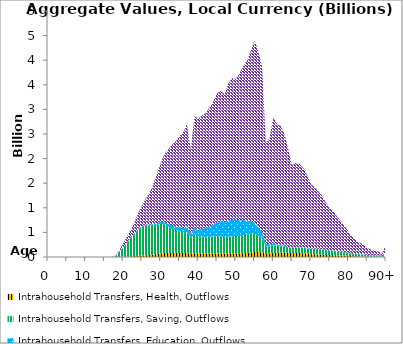
| Category | Intrahousehold Transfers, Health, Outflows | Intrahousehold Transfers, Saving, Outflows | Intrahousehold Transfers, Education, Outflows | Intrahousehold Transfers, Consumption other than health and education, Outflows |
|---|---|---|---|---|
| 0 | 0 | 0 | 0 | 0 |
|  | 0 | 0 | 0 | 0 |
| 2 | 0 | 0 | 0 | 0 |
| 3 | 0 | 0 | 0 | 0 |
| 4 | 0 | 0 | 0 | 0 |
| 5 | 0 | 0 | 0 | 0 |
| 6 | 0 | 0 | 0 | 0 |
| 7 | 0 | 0 | 0 | 0 |
| 8 | 0 | 0 | 0 | 0 |
| 9 | 0 | 0 | 0 | 0 |
| 10 | 0 | 0 | 0 | 0 |
| 11 | 0 | 0 | 0 | 0 |
| 12 | 0 | 0 | 0 | 0 |
| 13 | 0 | 0 | 0 | 0 |
| 14 | 0 | 0 | 0 | 0 |
| 15 | 0 | 0.012 | 0 | 0.002 |
| 16 | 0.004 | 0.12 | 0 | 0.112 |
| 17 | 0.012 | 1.714 | 0.008 | 0.146 |
| 18 | 0.34 | 16.93 | 0.686 | 9.93 |
| 19 | 1.321 | 103.145 | 3.721 | 36.324 |
| 20 | 4.648 | 187.638 | 5.847 | 73.819 |
| 21 | 7.855 | 280.53 | 8.076 | 116.932 |
| 22 | 12.068 | 367.101 | 10.371 | 163.048 |
| 23 | 18.044 | 450.398 | 11.619 | 229.375 |
| 24 | 23.233 | 540.06 | 12.349 | 315.246 |
| 25 | 27.668 | 584.253 | 12.83 | 405.222 |
| 26 | 34.873 | 613.429 | 13.35 | 524.926 |
| 27 | 41.714 | 598.201 | 15.242 | 652.961 |
| 28 | 49.29 | 606.843 | 18.647 | 801.529 |
| 29 | 59.084 | 597.184 | 26.199 | 995.435 |
| 30 | 70.276 | 606.795 | 37.058 | 1202.411 |
| 31 | 79.067 | 575.842 | 48.761 | 1383.607 |
| 32 | 82.101 | 540.527 | 54.924 | 1510.836 |
| 33 | 82.518 | 487.781 | 64.597 | 1647.742 |
| 34 | 84.834 | 464.434 | 71.629 | 1734.648 |
| 35 | 83.252 | 436.513 | 78.554 | 1856.155 |
| 36 | 81.358 | 419.827 | 84.51 | 1943.67 |
| 37 | 80.651 | 429.592 | 98.156 | 2092.436 |
| 38 | 63.14 | 321.452 | 85.313 | 1720.154 |
| 39 | 75.526 | 391.127 | 122.512 | 2276.624 |
| 40 | 72.123 | 350.564 | 133.823 | 2252.561 |
| 41 | 69.13 | 350.252 | 155.657 | 2308.576 |
| 42 | 69.053 | 333.143 | 178.349 | 2350.169 |
| 43 | 68.021 | 342.752 | 208.536 | 2417.339 |
| 44 | 67.006 | 354.352 | 242.453 | 2498.518 |
| 45 | 70.551 | 354.112 | 276.834 | 2629.007 |
| 46 | 70.471 | 347.827 | 296.807 | 2660.385 |
| 47 | 63.861 | 338.714 | 306.107 | 2595.995 |
| 48 | 66.998 | 347.553 | 329.983 | 2785.6 |
| 49 | 70.058 | 347.903 | 335.426 | 2885.24 |
| 50 | 67.239 | 359.458 | 331.263 | 2864.826 |
| 51 | 68.985 | 355.687 | 320.94 | 2989.275 |
| 52 | 76.053 | 369.21 | 306.305 | 3125.577 |
| 53 | 81.501 | 373.646 | 283.145 | 3260.454 |
| 54 | 89.396 | 379.41 | 260.958 | 3459.992 |
| 55 | 99.915 | 368.124 | 222.955 | 3710.063 |
| 56 | 99.995 | 331.469 | 175.322 | 3572.719 |
| 57 | 97.732 | 285.279 | 122.471 | 3370.294 |
| 58 | 59.177 | 154.393 | 55.678 | 2034.334 |
| 59 | 65.942 | 147.228 | 42.921 | 2164.194 |
| 60 | 81.739 | 159.826 | 33.309 | 2570.908 |
| 61 | 82.424 | 145.663 | 24.587 | 2446.828 |
| 62 | 88.366 | 128.488 | 18.321 | 2427.868 |
| 63 | 91.779 | 122.491 | 13.259 | 2269.727 |
| 64 | 84.573 | 112.453 | 8.479 | 1969.853 |
| 65 | 76.614 | 105.165 | 6.064 | 1671.363 |
| 66 | 81.287 | 108.989 | 6.261 | 1722.489 |
| 67 | 81.54 | 112.439 | 6.605 | 1687.324 |
| 68 | 76.453 | 110.169 | 6.048 | 1614.564 |
| 69 | 67.88 | 105.987 | 5.957 | 1489.378 |
| 70 | 56.809 | 106.396 | 7.03 | 1319.044 |
| 71 | 53.639 | 109.323 | 7.165 | 1243.785 |
| 72 | 48.761 | 110.506 | 8.035 | 1167.831 |
| 73 | 44.876 | 109.975 | 8.618 | 1081.417 |
| 74 | 41.317 | 97.988 | 9.402 | 955.424 |
| 75 | 39.474 | 89.949 | 8.145 | 868.789 |
| 76 | 37.696 | 85.06 | 8.801 | 808.378 |
| 77 | 32.836 | 75.831 | 7.414 | 702.832 |
| 78 | 30.981 | 70.133 | 7.521 | 623.472 |
| 79 | 27.287 | 70.308 | 5.628 | 532.07 |
| 80 | 21.673 | 60.145 | 4.811 | 424.805 |
| 81 | 16.956 | 53.321 | 4.946 | 347.453 |
| 82 | 13.95 | 47.403 | 4.273 | 284.329 |
| 83 | 10.677 | 45.728 | 3.32 | 227.436 |
| 84 | 9.06 | 43.484 | 3.061 | 207.967 |
| 85 | 6.415 | 32.121 | 2.028 | 142.127 |
| 86 | 5.631 | 32.226 | 0.768 | 115.232 |
| 87 | 5.447 | 30.953 | 0.613 | 88.472 |
| 88 | 4.302 | 27.064 | 0.634 | 77.885 |
| 89 | 3.278 | 22.35 | 0.69 | 55.837 |
| 90+ | 10.897 | 81.687 | 3.178 | 170.618 |